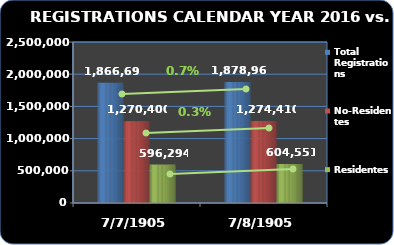
| Category | Total Registrations | No-Residentes | Residentes |
|---|---|---|---|
| 2016.0 | 1878961 | 1274410 | 604551 |
| 2015.0 | 1866694 | 1270400 | 596294 |